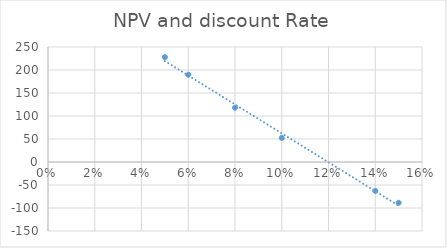
| Category | Series 0 |
|---|---|
| 0.05 | 228.06 |
| 0.06 | 189.65 |
| 0.08 | 117.927 |
| 0.1 | 52.38 |
| 0.14 | -62.72 |
| 0.15 | -88.58 |